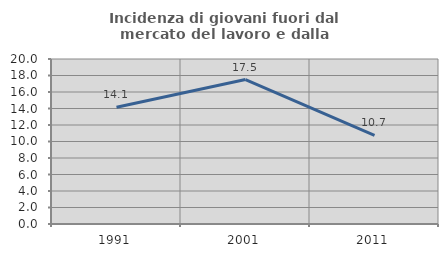
| Category | Incidenza di giovani fuori dal mercato del lavoro e dalla formazione  |
|---|---|
| 1991.0 | 14.143 |
| 2001.0 | 17.505 |
| 2011.0 | 10.749 |